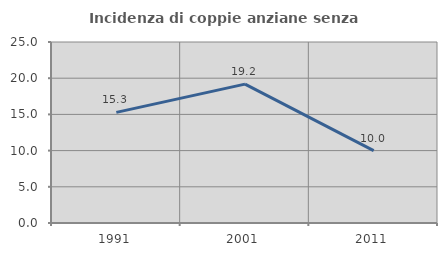
| Category | Incidenza di coppie anziane senza figli  |
|---|---|
| 1991.0 | 15.278 |
| 2001.0 | 19.178 |
| 2011.0 | 10 |